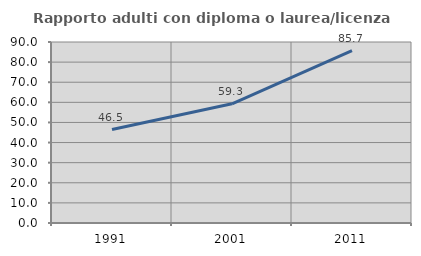
| Category | Rapporto adulti con diploma o laurea/licenza media  |
|---|---|
| 1991.0 | 46.455 |
| 2001.0 | 59.273 |
| 2011.0 | 85.667 |